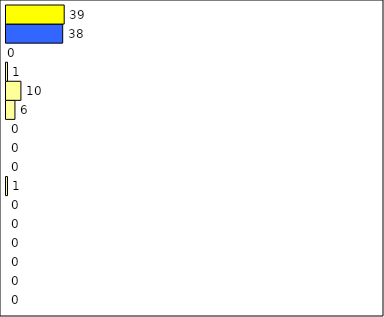
| Category | -2 | -1 | 0 | 1 | 2 | 3 | 4 | 5 | 6 | 7 | 8 | 9 | 10 | 11 | 12 | Perfect Round |
|---|---|---|---|---|---|---|---|---|---|---|---|---|---|---|---|---|
| 0 | 0 | 0 | 0 | 0 | 0 | 0 | 1 | 0 | 0 | 0 | 6 | 10 | 1 | 0 | 38 | 39 |